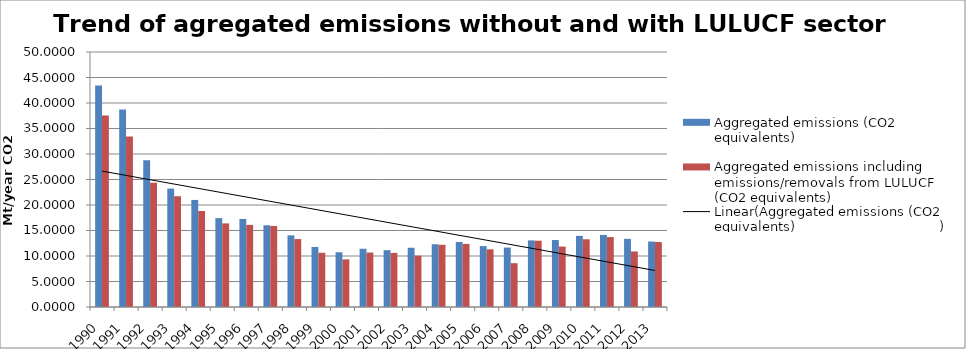
| Category | Aggregated emissions (CO2 equivalents)                                     | Aggregated emissions including emissions/removals from LULUCF (CO2 equivalents) |
|---|---|---|
| 1990.0 | 43.419 | 37.532 |
| 1991.0 | 38.747 | 33.451 |
| 1992.0 | 28.754 | 24.37 |
| 1993.0 | 23.218 | 21.717 |
| 1994.0 | 20.991 | 18.827 |
| 1995.0 | 17.424 | 16.395 |
| 1996.0 | 17.264 | 16.097 |
| 1997.0 | 16.026 | 15.889 |
| 1998.0 | 14.044 | 13.322 |
| 1999.0 | 11.772 | 10.637 |
| 2000.0 | 10.731 | 9.338 |
| 2001.0 | 11.421 | 10.671 |
| 2002.0 | 11.142 | 10.609 |
| 2003.0 | 11.617 | 10.063 |
| 2004.0 | 12.304 | 12.201 |
| 2005.0 | 12.753 | 12.378 |
| 2006.0 | 11.943 | 11.304 |
| 2007.0 | 11.659 | 8.593 |
| 2008.0 | 13.059 | 12.999 |
| 2009.0 | 13.137 | 11.852 |
| 2010.0 | 13.939 | 13.282 |
| 2011.0 | 14.142 | 13.712 |
| 2012.0 | 13.364 | 10.894 |
| 2013.0 | 12.836 | 12.739 |